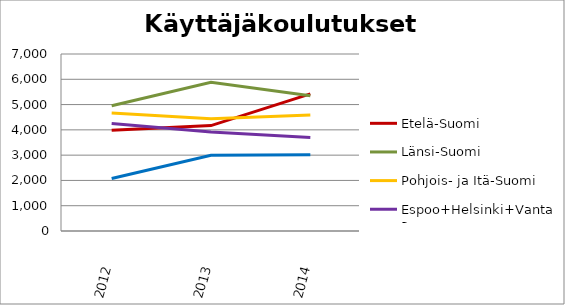
| Category | Etelä-Suomi | Länsi-Suomi | Pohjois- ja Itä-Suomi | Espoo+Helsinki+Vantaa | Muu Uusimaa |
|---|---|---|---|---|---|
| 2012.0 | 3987 | 4953 | 4666 | 4251 | 2073 |
| 2013.0 | 4168 | 5878 | 4438 | 3916 | 2994 |
| 2014.0 | 5421 | 5349 | 4589 | 3701 | 3014 |